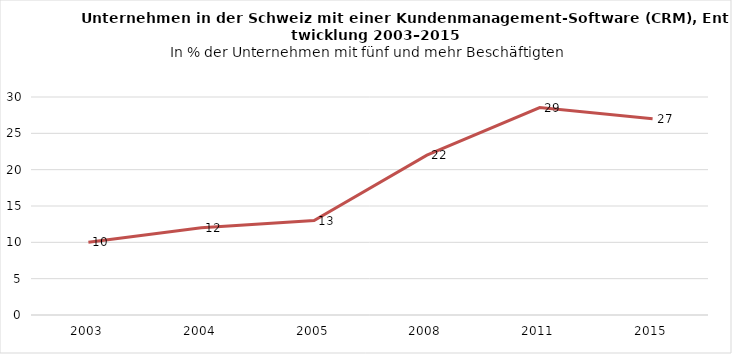
| Category | % |
|---|---|
| 2003.0 | 10 |
| 2004.0 | 12 |
| 2005.0 | 13 |
| 2008.0 | 22 |
| 2011.0 | 28.543 |
| 2015.0 | 27 |